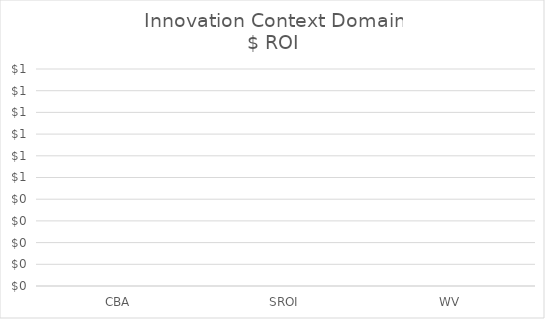
| Category | Innovation |
|---|---|
| CBA | 0 |
| SROI | 0 |
| WV | 0 |